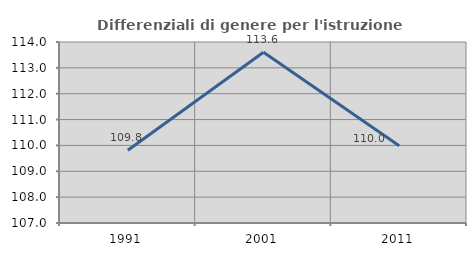
| Category | Differenziali di genere per l'istruzione superiore |
|---|---|
| 1991.0 | 109.816 |
| 2001.0 | 113.603 |
| 2011.0 | 109.989 |